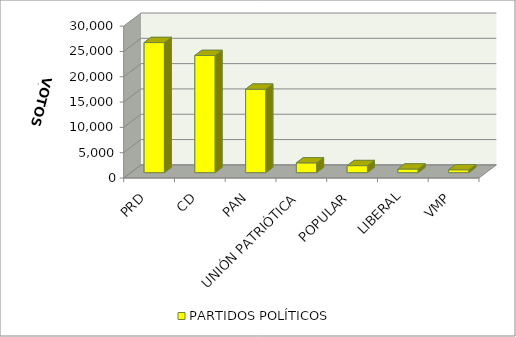
| Category | PARTIDOS POLÍTICOS |
|---|---|
| PRD | 25696 |
| CD | 23135 |
| PAN | 16483 |
| UNIÓN PATRIÓTICA | 1930 |
| POPULAR | 1384 |
| LIBERAL | 711 |
| VMP | 567 |